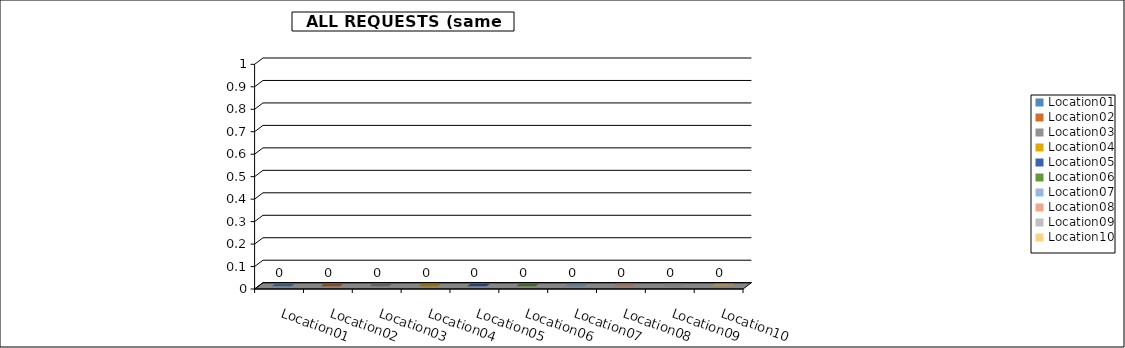
| Category | Series 0 |
|---|---|
| Location01 | 0 |
| Location02 | 0 |
| Location03 | 0 |
| Location04 | 0 |
| Location05 | 0 |
| Location06 | 0 |
| Location07 | 0 |
| Location08 | 0 |
| Location09 | 0 |
| Location10 | 0 |